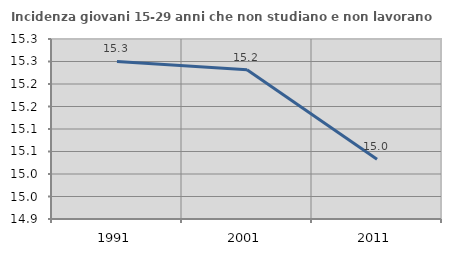
| Category | Incidenza giovani 15-29 anni che non studiano e non lavorano  |
|---|---|
| 1991.0 | 15.25 |
| 2001.0 | 15.232 |
| 2011.0 | 15.033 |